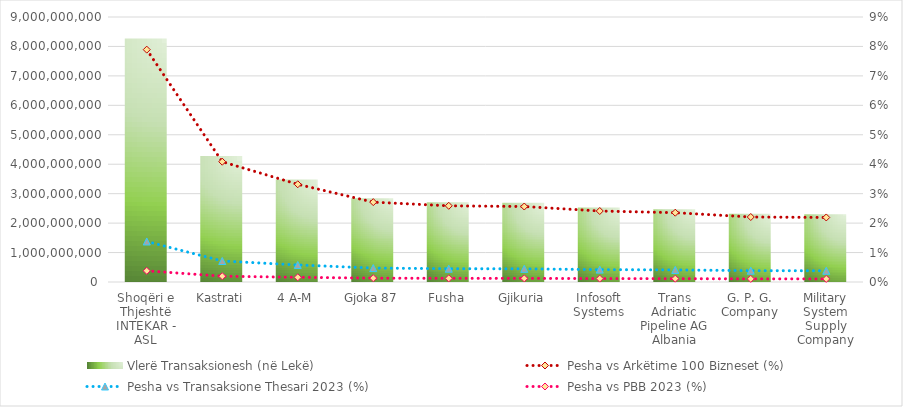
| Category | Vlerë Transaksionesh (në Lekë) |
|---|---|
| Shoqëri e Thjeshtë INTEKAR - ASL | 8273250018 |
| Kastrati | 4283155920 |
| 4 A-M | 3479657287 |
| Gjoka 87 | 2844000000 |
| Fusha | 2712493115 |
| Gjikuria | 2687665143 |
| Infosoft Systems | 2527802415 |
| Trans Adriatic Pipeline AG Albania | 2467783764 |
| G. P. G. Company | 2314448622 |
| Military System Supply Company | 2297895907 |